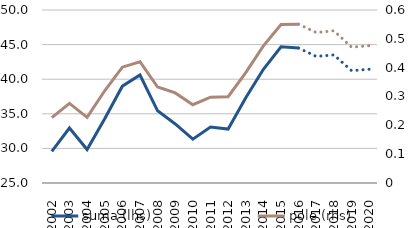
| Category | suma (lhs) |
|---|---|
| 2002.0 | 29.575 |
| 2003.0 | 32.946 |
| 2004.0 | 29.836 |
| 2005.0 | 34.289 |
| 2006.0 | 38.991 |
| 2007.0 | 40.61 |
| 2008.0 | 35.433 |
| 2009.0 | 33.537 |
| 2010.0 | 31.333 |
| 2011.0 | 33.1 |
| 2012.0 | 32.79 |
| 2013.0 | 37.313 |
| 2014.0 | 41.435 |
| 2015.0 | 44.696 |
| 2016.0 | 44.502 |
| 2017.0 | 43.284 |
| 2018.0 | 43.511 |
| 2019.0 | 41.236 |
| 2020.0 | 41.436 |